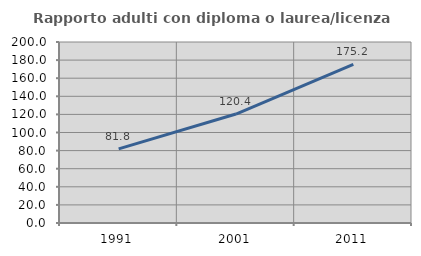
| Category | Rapporto adulti con diploma o laurea/licenza media  |
|---|---|
| 1991.0 | 81.849 |
| 2001.0 | 120.388 |
| 2011.0 | 175.196 |